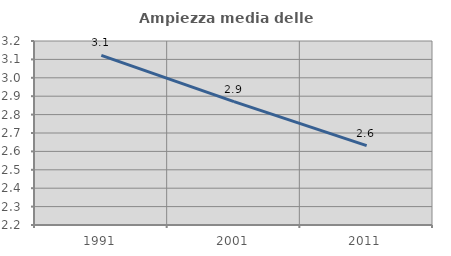
| Category | Ampiezza media delle famiglie |
|---|---|
| 1991.0 | 3.122 |
| 2001.0 | 2.871 |
| 2011.0 | 2.631 |